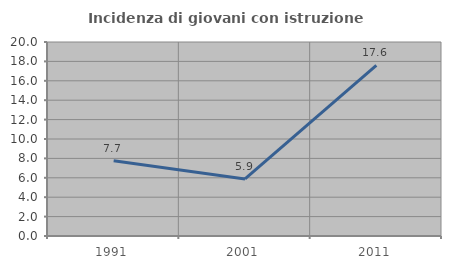
| Category | Incidenza di giovani con istruzione universitaria |
|---|---|
| 1991.0 | 7.746 |
| 2001.0 | 5.882 |
| 2011.0 | 17.6 |